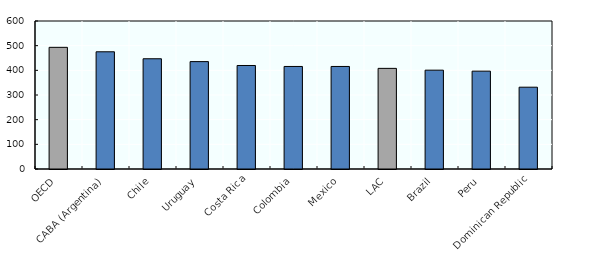
| Category | Series 0 |
|---|---|
| OECD | 493.202 |
| CABA (Argentina) | 475.187 |
| Chile | 446.956 |
| Uruguay | 435.363 |
| Costa Rica | 419.608 |
| Colombia | 415.729 |
| Mexico | 415.71 |
| LAC | 408 |
| Brazil | 400.682 |
| Peru | 396.684 |
| Dominican Republic | 331.639 |